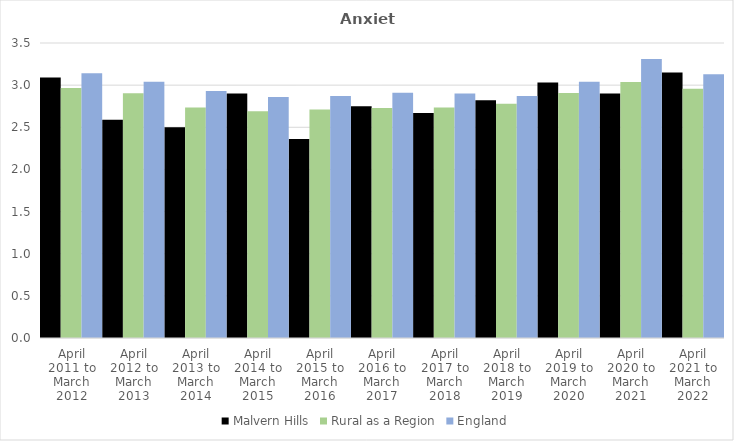
| Category | Malvern Hills | Rural as a Region | England |
|---|---|---|---|
| April 2011 to March 2012 | 3.09 | 2.967 | 3.14 |
| April 2012 to March 2013 | 2.59 | 2.904 | 3.04 |
| April 2013 to March 2014 | 2.5 | 2.734 | 2.93 |
| April 2014 to March 2015 | 2.9 | 2.691 | 2.86 |
| April 2015 to March 2016 | 2.36 | 2.711 | 2.87 |
| April 2016 to March 2017 | 2.75 | 2.729 | 2.91 |
| April 2017 to March 2018 | 2.67 | 2.736 | 2.9 |
| April 2018 to March 2019 | 2.82 | 2.78 | 2.87 |
| April 2019 to March 2020 | 3.03 | 2.908 | 3.04 |
| April 2020 to March 2021 | 2.9 | 3.036 | 3.31 |
| April 2021 to March 2022 | 3.15 | 2.956 | 3.13 |